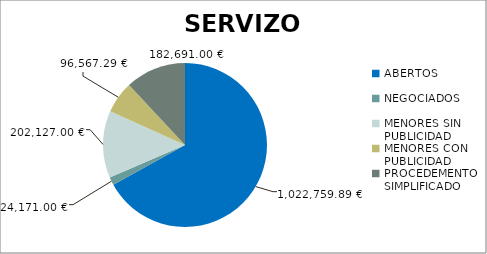
| Category | Series 0 |
|---|---|
| ABERTOS  | 1022759.89 |
| NEGOCIADOS  | 24171 |
| MENORES SIN PUBLICIDAD | 202127 |
| MENORES CON PUBLICIDAD | 96567.29 |
| PROCEDEMENTO SIMPLIFICADO | 182691 |